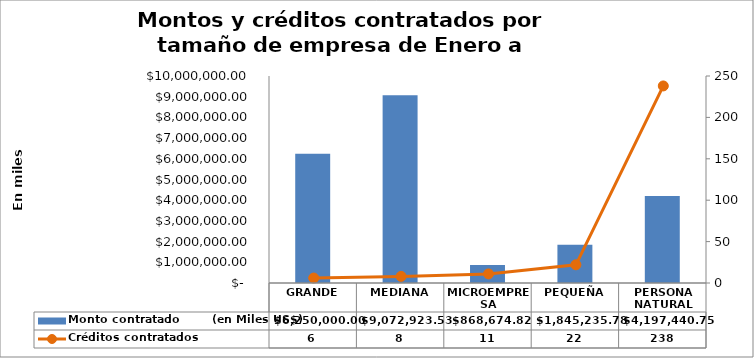
| Category | Monto contratado        (en Miles US$) |
|---|---|
| GRANDE | 6250000 |
| MEDIANA | 9072923.53 |
| MICROEMPRESA | 868674.82 |
| PEQUEÑA | 1845235.78 |
| PERSONA NATURAL | 4197440.75 |